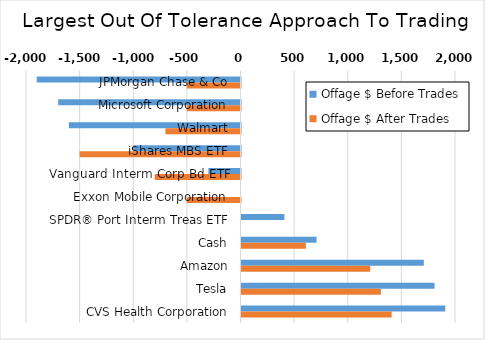
| Category | Offage $ Before Trades | Offage $ After Trades |
|---|---|---|
| JPMorgan Chase & Co | -1900 | -500 |
| Microsoft Corporation | -1700 | -500 |
| Walmart | -1600 | -700 |
| iShares MBS ETF | -1000 | -1500 |
| Vanguard Interm Corp Bd ETF | -300 | -800 |
| Exxon Mobile Corporation | 0 | -500 |
| SPDR® Port Interm Treas ETF | 400 | 0 |
| Cash | 700 | 600 |
| Amazon | 1700 | 1200 |
| Tesla | 1800 | 1300 |
| CVS Health Corporation | 1900 | 1400 |